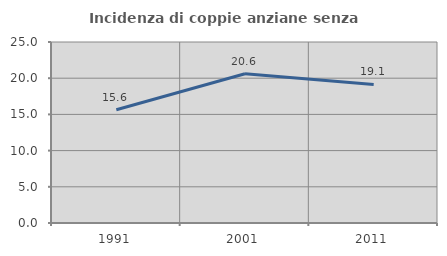
| Category | Incidenza di coppie anziane senza figli  |
|---|---|
| 1991.0 | 15.649 |
| 2001.0 | 20.623 |
| 2011.0 | 19.13 |